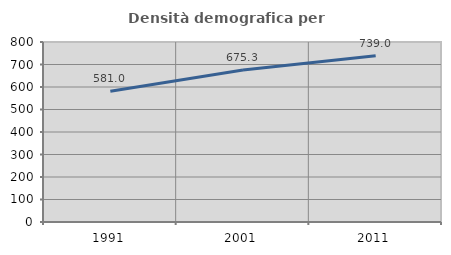
| Category | Densità demografica |
|---|---|
| 1991.0 | 580.984 |
| 2001.0 | 675.325 |
| 2011.0 | 739.028 |